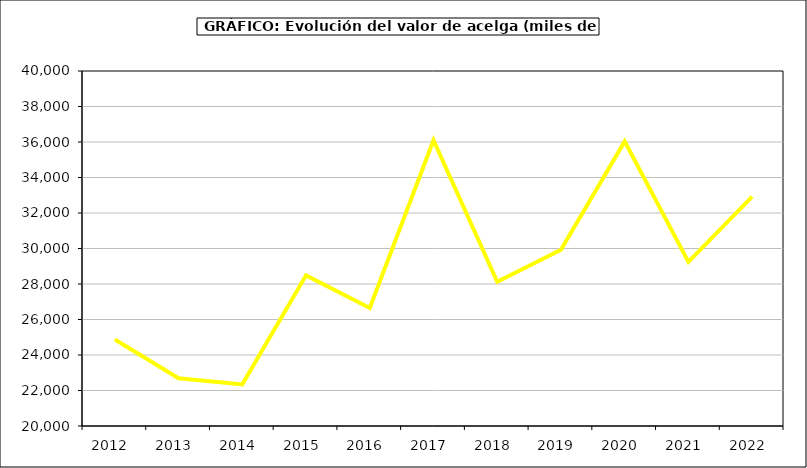
| Category | Valor |
|---|---|
| 2012.0 | 24870.933 |
| 2013.0 | 22693.234 |
| 2014.0 | 22344.648 |
| 2015.0 | 28487 |
| 2016.0 | 26648 |
| 2017.0 | 36102.37 |
| 2018.0 | 28124.995 |
| 2019.0 | 29932.874 |
| 2020.0 | 36031.954 |
| 2021.0 | 29239.442 |
| 2022.0 | 32917.483 |